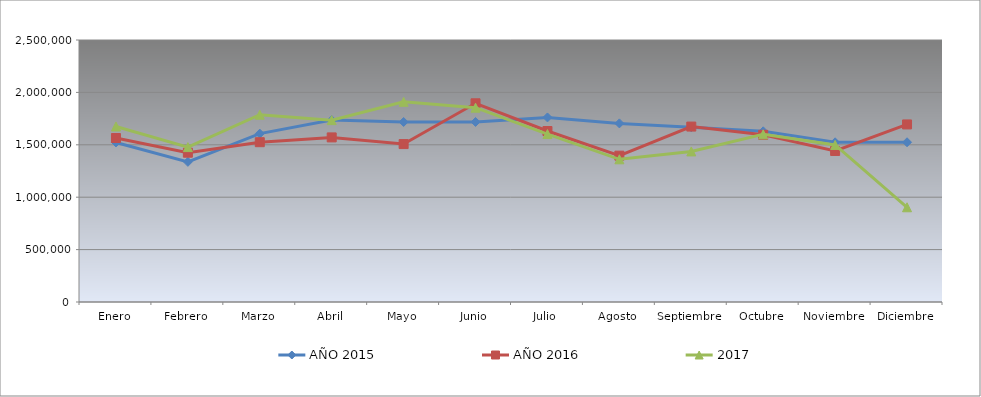
| Category | AÑO 2015 | AÑO 2016 | 2017 |
|---|---|---|---|
| Enero | 1522530 | 1564870 | 1674640 |
| Febrero | 1337200 | 1424570 | 1478005 |
| Marzo | 1606500 | 1524810 | 1786995 |
| Abril | 1736160 | 1570600 | 1735400 |
| Mayo | 1717700 | 1506960 | 1910100 |
| Junio | 1717910 | 1896080 | 1853965 |
| Julio | 1761220 | 1631560 | 1602555 |
| Agosto | 1704380 | 1396520 | 1361595 |
| Septiembre | 1667050 | 1673920 | 1436920 |
| Octubre | 1628800 | 1595420 | 1599530 |
| Noviembre | 1523590 | 1441060 | 1498610 |
| Diciembre | 1524080 | 1694320 | 903940 |